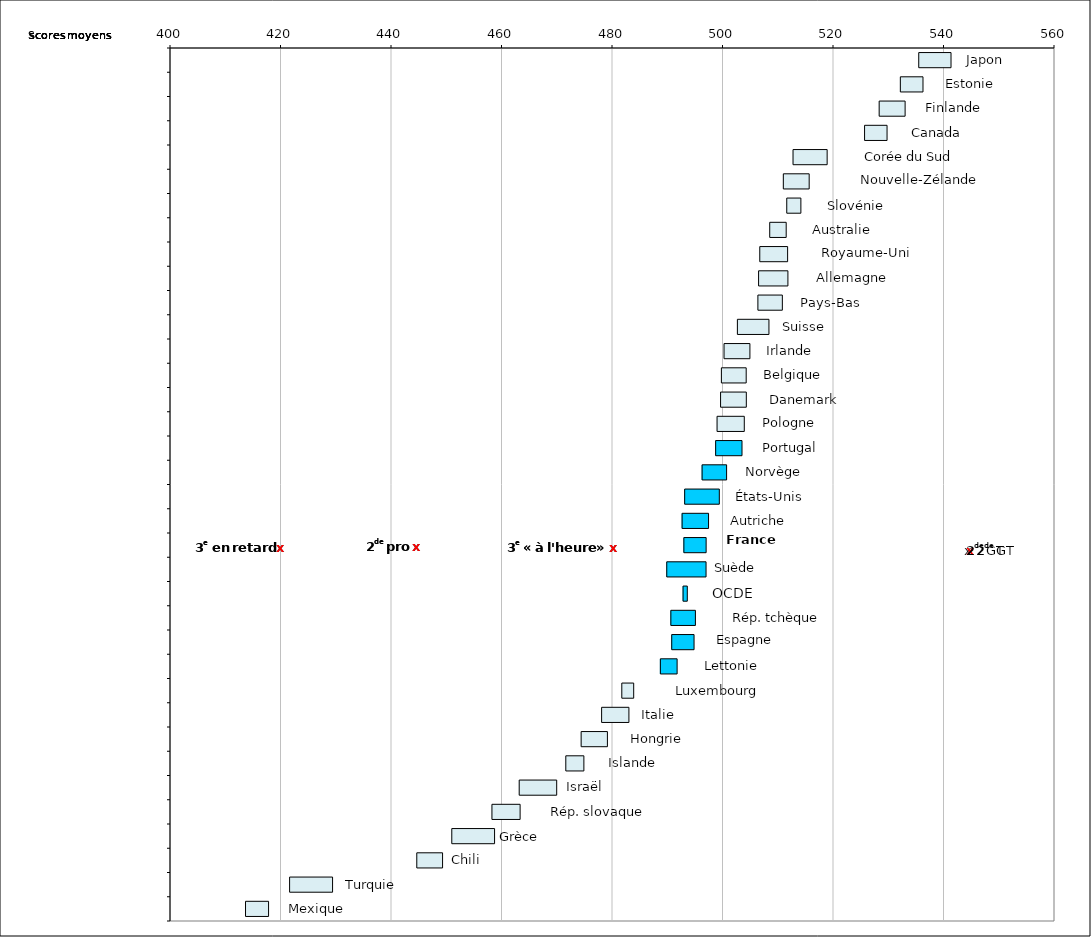
| Category | Series 0 | Series 1 | Series 2 |
|---|---|---|---|
| 1.Japon | 535.429 | 5.932 |  |
| 2.Estonie | 532.099 | 4.19 |  |
| 3.Finlande | 528.269 | 4.785 |  |
| 4.Canada | 525.624 | 4.161 |  |
| 5.Corée | 512.678 | 6.264 |  |
| 6.Nouvelle-Zélande | 510.919 | 4.768 |  |
| 7.Slovénie | 511.539 | 2.649 |  |
| 8.Australie | 508.459 | 3.071 |  |
| 9.Royaume-Uni | 506.657 | 5.129 |  |
| 10.Allemagne | 506.442 | 5.398 |  |
| 11.Pays-Bas | 506.317 | 4.515 |  |
| 12.Suisse | 502.606 | 5.801 |  |
| 13.Irlande | 500.189 | 4.772 |  |
| 14.Belgique | 499.71 | 4.579 |  |
| 15.Danemark | 499.561 | 4.751 |  |
| 16.Pologne | 498.928 | 5.015 |  |
| 17.Portugal | 498.669 | 4.862 |  |
| 18.Norvège | 496.219 | 4.525 |  |
| 19.États-Unis | 493.061 | 6.362 |  |
| 20.Autriche | 492.598 | 4.879 |  |
| 21.France | 492.917 | 4.121 |  |
| 22.Suède | 489.822 | 7.201 |  |
| OCDE | 492.773 | 0.857 |  |
| 23.Rép. tchèque | 490.562 | 4.535 |  |
| 24.Espagne | 490.721 | 4.131 |  |
| 25.Lettonie | 488.665 | 3.121 |  |
| 26.Luxembourg | 481.685 | 2.242 |  |
| 27.Italie | 478.031 | 5.032 |  |
| 28.Hongrie | 474.326 | 4.843 |  |
| 29.Islande | 471.549 | 3.362 |  |
| 30.Israël | 463.115 | 6.875 |  |
| 31.Rép. slovaque | 458.181 | 5.187 |  |
| 32.Grèce | 450.912 | 7.835 |  |
| 33.Chili | 444.577 | 4.759 |  |
| 34.Turquie | 421.556 | 7.868 |  |
| 35.Mexique | 413.579 | 4.261 |  |